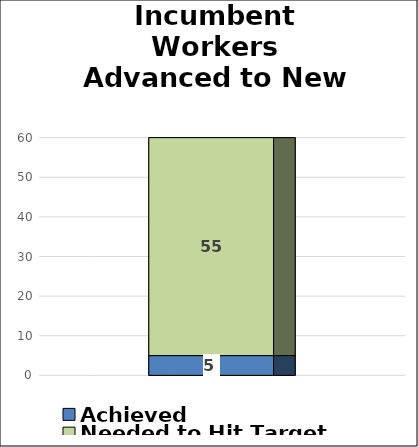
| Category | Achieved | Needed to Hit Target |
|---|---|---|
| Number Incumbent Workers Advanced to New Position | 5 | 55 |